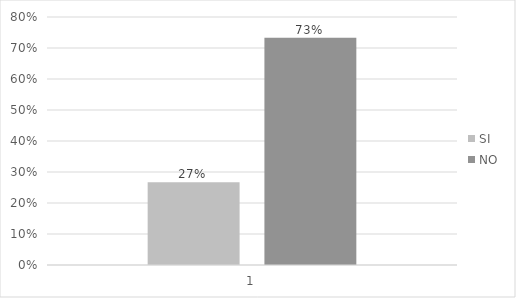
| Category | SI | NO |
|---|---|---|
| 0 | 0.267 | 0.733 |